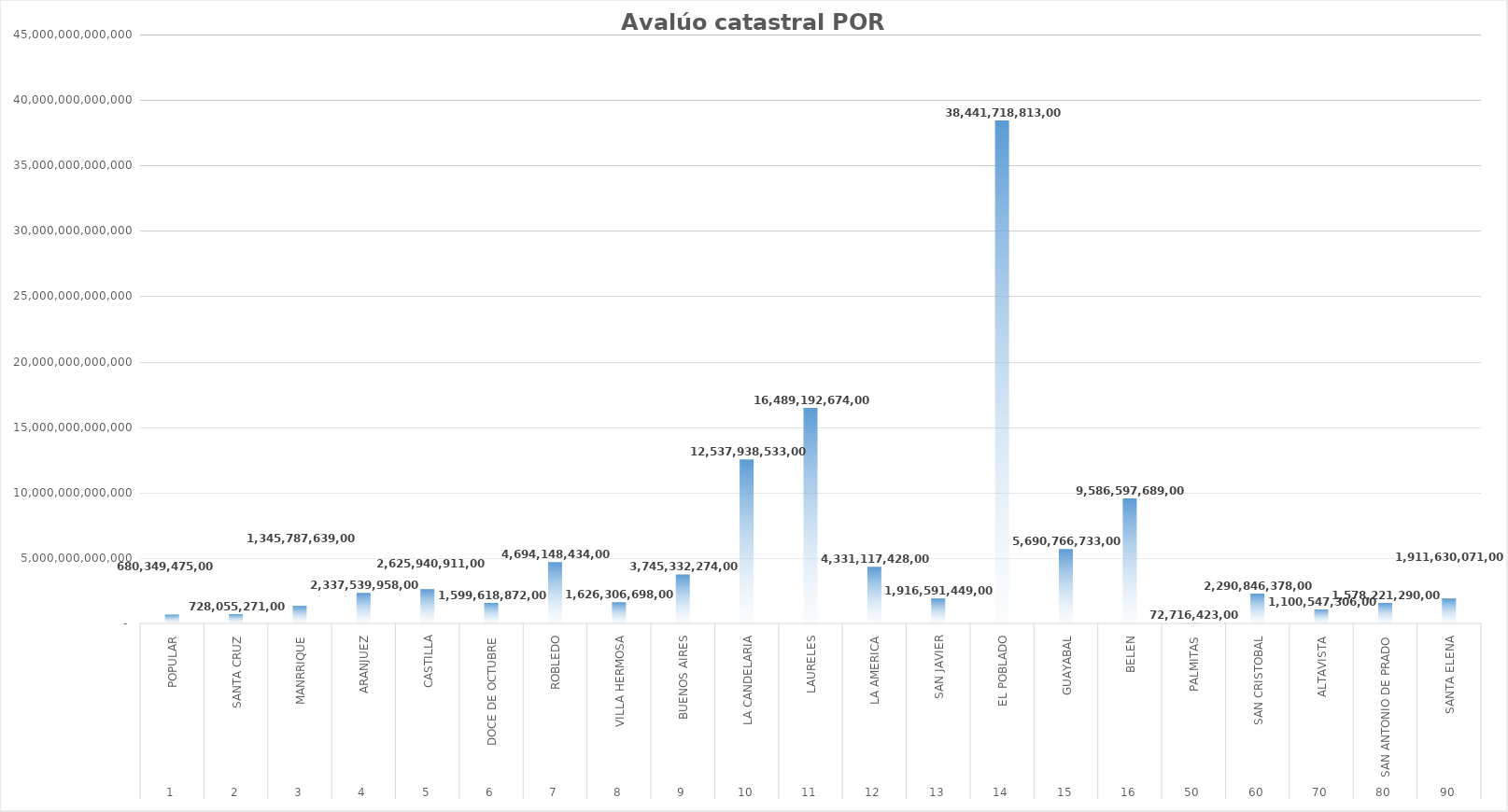
| Category | Avalúo Total |
|---|---|
| 0 | 680349475000 |
| 1 | 728055271000 |
| 2 | 1345787639000 |
| 3 | 2337539958000 |
| 4 | 2625940911000 |
| 5 | 1599618872000 |
| 6 | 4694148434000 |
| 7 | 1626306698000 |
| 8 | 3745332274000 |
| 9 | 12537938533000 |
| 10 | 16489192674000 |
| 11 | 4331117428000 |
| 12 | 1916591449000 |
| 13 | 38441718813000 |
| 14 | 5690766733000 |
| 15 | 9586597689000 |
| 16 | 72716423000 |
| 17 | 2290846378000 |
| 18 | 1100547306000 |
| 19 | 1578221290000 |
| 20 | 1911630071000 |